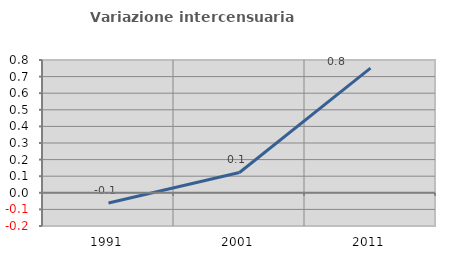
| Category | Variazione intercensuaria annua |
|---|---|
| 1991.0 | -0.061 |
| 2001.0 | 0.122 |
| 2011.0 | 0.751 |